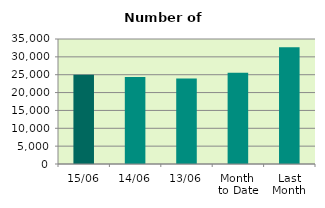
| Category | Series 0 |
|---|---|
| 15/06 | 24994 |
| 14/06 | 24378 |
| 13/06 | 23928 |
| Month 
to Date | 25550.545 |
| Last
Month | 32723.818 |